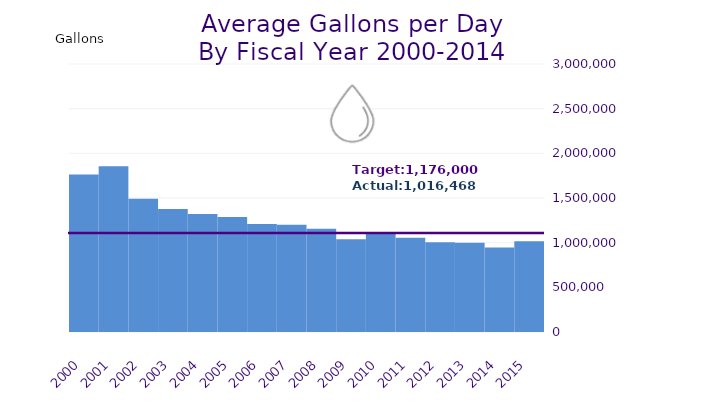
| Category | Average Daily Water Consumption in Gallons |
|---|---|
| 2000.0 | 1761762.862 |
| 2001.0 | 1855040 |
| 2002.0 | 1492537.368 |
| 2003.0 | 1376943.333 |
| 2004.0 | 1322090 |
| 2005.0 | 1287806.667 |
| 2006.0 | 1207721.116 |
| 2007.0 | 1199916.667 |
| 2008.0 | 1154924.433 |
| 2009.0 | 1037226.667 |
| 2010.0 | 1117854.607 |
| 2011.0 | 1055363.656 |
| 2012.0 | 1003353.497 |
| 2013.0 | 999183.226 |
| 2014.0 | 944925.796 |
| 2015.0 | 1016467.756 |